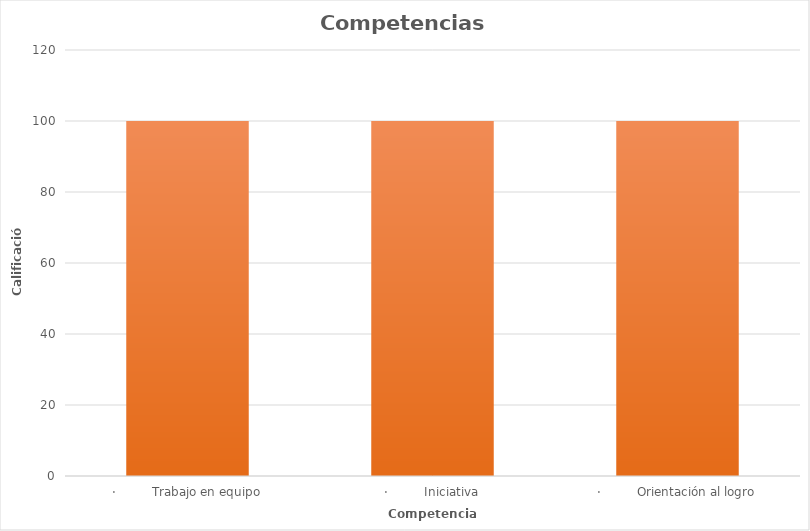
| Category | Series 0 |
|---|---|
| ·         Trabajo en equipo | 100 |
| ·         Iniciativa | 100 |
| ·         Orientación al logro | 100 |